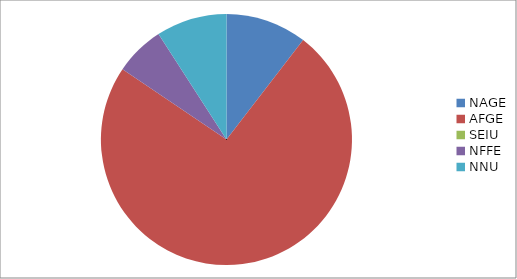
| Category | Series 0 |
|---|---|
| NAGE | 1490 |
| AFGE | 10546 |
| SEIU | 0 |
| NFFE | 916 |
| NNU | 1299 |